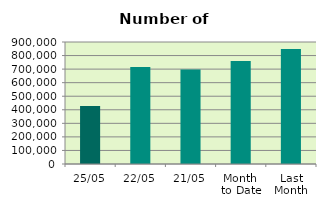
| Category | Series 0 |
|---|---|
| 25/05 | 427998 |
| 22/05 | 715164 |
| 21/05 | 696564 |
| Month 
to Date | 758967.875 |
| Last
Month | 848119.7 |